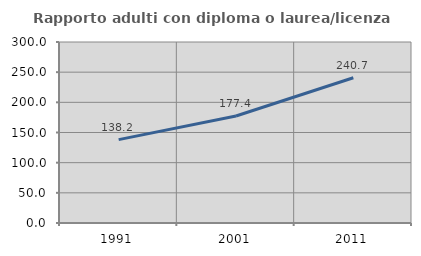
| Category | Rapporto adulti con diploma o laurea/licenza media  |
|---|---|
| 1991.0 | 138.161 |
| 2001.0 | 177.376 |
| 2011.0 | 240.704 |